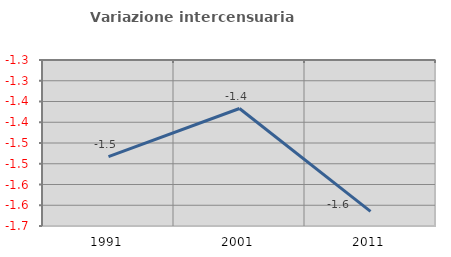
| Category | Variazione intercensuaria annua |
|---|---|
| 1991.0 | -1.483 |
| 2001.0 | -1.367 |
| 2011.0 | -1.615 |